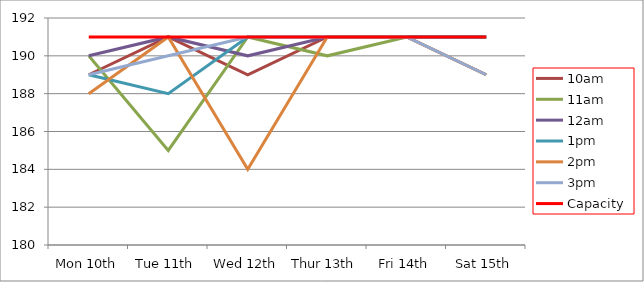
| Category | 9am | 10am | 11am | 12am | 1pm | 2pm | 3pm | 4pm | 5pm | Capacity |
|---|---|---|---|---|---|---|---|---|---|---|
| Mon 10th |  | 189 | 190 | 190 | 189 | 188 | 189 |  |  | 191 |
| Tue 11th |  | 191 | 185 | 191 | 188 | 191 | 190 |  |  | 191 |
| Wed 12th |  | 189 | 191 | 190 | 191 | 184 | 191 |  |  | 191 |
| Thur 13th |  | 191 | 190 | 191 | 191 | 191 | 191 |  |  | 191 |
| Fri 14th |  | 191 | 191 | 191 | 191 | 191 | 191 |  |  | 191 |
| Sat 15th |  | 189 | 191 | 191 | 191 | 189 | 189 |  |  | 191 |